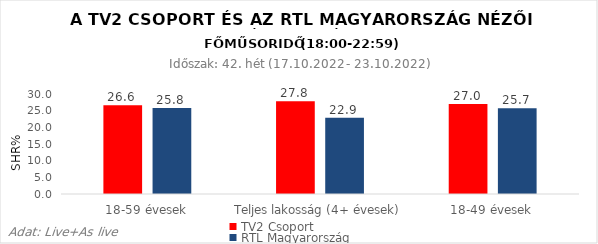
| Category | TV2 Csoport | RTL Magyarország |
|---|---|---|
| 18-59 évesek | 26.6 | 25.8 |
| Teljes lakosság (4+ évesek) | 27.8 | 22.9 |
| 18-49 évesek | 27 | 25.7 |